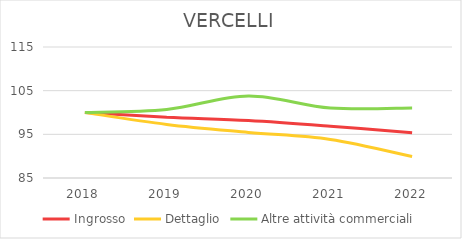
| Category | Ingrosso | Dettaglio | Altre attività commerciali |
|---|---|---|---|
| 2018.0 | 100 | 100 | 100 |
| 2019.0 | 98.93 | 97.278 | 100.687 |
| 2020.0 | 98.167 | 95.441 | 103.78 |
| 2021.0 | 96.868 | 93.834 | 101.031 |
| 2022.0 | 95.34 | 89.931 | 101.031 |